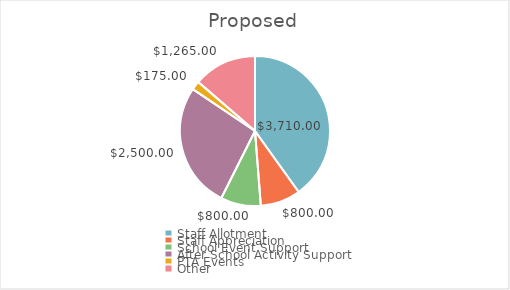
| Category | Proposed |
|---|---|
| Staff Allotment | 3710 |
| Staff Appreciation | 800 |
| School Event Support | 800 |
| After School Activity Support | 2500 |
| PTA Events | 175 |
| Other | 1265 |